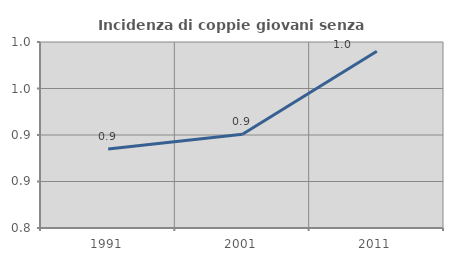
| Category | Incidenza di coppie giovani senza figli |
|---|---|
| 1991.0 | 0.885 |
| 2001.0 | 0.901 |
| 2011.0 | 0.99 |